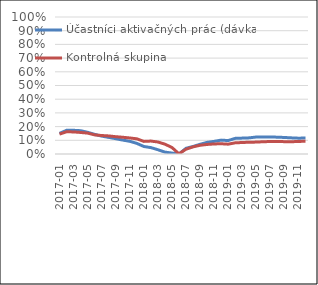
| Category | Účastníci aktivačných prác (dávka) | Kontrolná skupina |
|---|---|---|
| 2017-01 | 0.151 | 0.145 |
| 2017-02 | 0.173 | 0.162 |
| 2017-03 | 0.173 | 0.161 |
| 2017-04 | 0.17 | 0.157 |
| 2017-05 | 0.158 | 0.152 |
| 2017-06 | 0.143 | 0.14 |
| 2017-07 | 0.13 | 0.135 |
| 2017-08 | 0.121 | 0.132 |
| 2017-09 | 0.112 | 0.126 |
| 2017-10 | 0.102 | 0.122 |
| 2017-11 | 0.093 | 0.117 |
| 2017-12 | 0.077 | 0.111 |
| 2018-01 | 0.055 | 0.092 |
| 2018-02 | 0.047 | 0.094 |
| 2018-03 | 0.031 | 0.088 |
| 2018-04 | 0.014 | 0.072 |
| 2018-05 | 0.007 | 0.048 |
| 2018-06 | 0 | 0.001 |
| 2018-07 | 0.042 | 0.035 |
| 2018-08 | 0.055 | 0.052 |
| 2018-09 | 0.071 | 0.064 |
| 2018-10 | 0.085 | 0.07 |
| 2018-11 | 0.092 | 0.073 |
| 2018-12 | 0.101 | 0.075 |
| 2019-01 | 0.098 | 0.072 |
| 2019-02 | 0.114 | 0.082 |
| 2019-03 | 0.116 | 0.084 |
| 2019-04 | 0.118 | 0.086 |
| 2019-05 | 0.124 | 0.087 |
| 2019-06 | 0.124 | 0.09 |
| 2019-07 | 0.124 | 0.091 |
| 2019-08 | 0.123 | 0.091 |
| 2019-09 | 0.121 | 0.09 |
| 2019-10 | 0.118 | 0.09 |
| 2019-11 | 0.116 | 0.091 |
| 2019-12 | 0.116 | 0.094 |